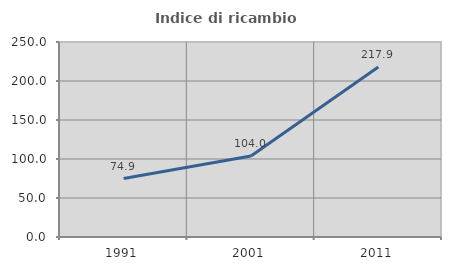
| Category | Indice di ricambio occupazionale  |
|---|---|
| 1991.0 | 74.937 |
| 2001.0 | 103.968 |
| 2011.0 | 217.931 |